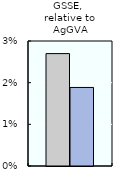
| Category | 2000-02 | 2016-18 |
|---|---|---|
| GSSE, 
relative to AgGVA | 0.027 | 0.019 |